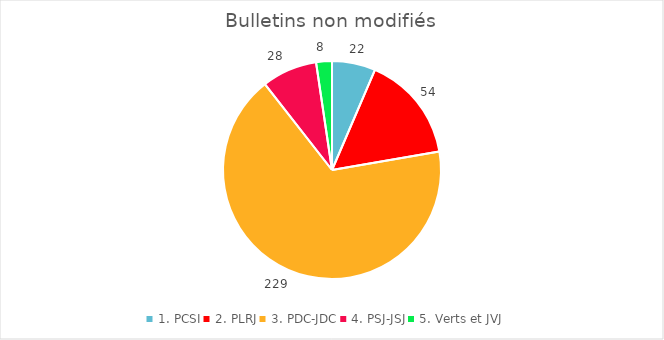
| Category | Series 0 |
|---|---|
| 1. PCSI | 22 |
| 2. PLRJ | 54 |
| 3. PDC-JDC | 229 |
| 4. PSJ-JSJ | 28 |
| 5. Verts et JVJ | 8 |